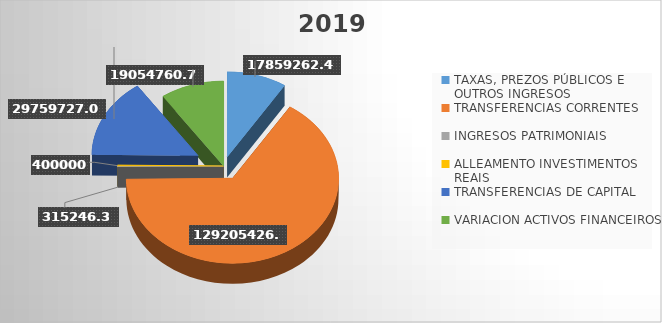
| Category | Series 0 |
|---|---|
| TAXAS, PREZOS PÚBLICOS E OUTROS INGRESOS | 17859262.48 |
| TRANSFERENCIAS CORRENTES | 129205426.08 |
| INGRESOS PATRIMONIAIS | 315246.37 |
| ALLEAMENTO INVESTIMENTOS REAIS | 400000 |
| TRANSFERENCIAS DE CAPITAL | 29759727.03 |
| VARIACION ACTIVOS FINANCEIROS | 19054760.76 |